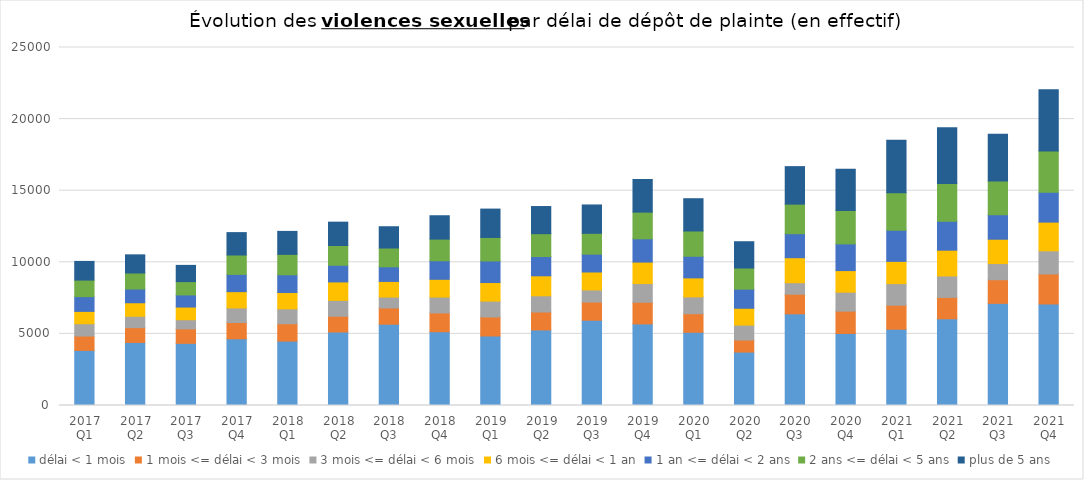
| Category | délai < 1 mois | 1 mois <= délai < 3 mois | 3 mois <= délai < 6 mois | 6 mois <= délai < 1 an | 1 an <= délai < 2 ans | 2 ans <= délai < 5 ans | plus de 5 ans |
|---|---|---|---|---|---|---|---|
| 2017 Q1 | 3848 | 1004 | 857 | 863 | 1029 | 1156 | 1305 |
| 2017 Q2 | 4405 | 1031 | 794 | 945 | 959 | 1119 | 1267 |
| 2017 Q3 | 4341 | 1010 | 638 | 886 | 846 | 931 | 1133 |
| 2017 Q4 | 4659 | 1139 | 1014 | 1139 | 1204 | 1354 | 1564 |
| 2018 Q1 | 4499 | 1209 | 1043 | 1141 | 1237 | 1426 | 1603 |
| 2018 Q2 | 5135 | 1099 | 1106 | 1290 | 1164 | 1378 | 1631 |
| 2018 Q3 | 5677 | 1135 | 759 | 1091 | 1022 | 1314 | 1486 |
| 2018 Q4 | 5153 | 1314 | 1103 | 1242 | 1294 | 1513 | 1632 |
| 2019 Q1 | 4854 | 1329 | 1106 | 1298 | 1505 | 1643 | 1981 |
| 2019 Q2 | 5276 | 1254 | 1130 | 1397 | 1344 | 1599 | 1894 |
| 2019 Q3 | 5955 | 1268 | 846 | 1254 | 1244 | 1458 | 1979 |
| 2019 Q4 | 5698 | 1511 | 1307 | 1499 | 1628 | 1860 | 2279 |
| 2020 Q1 | 5112 | 1298 | 1173 | 1330 | 1507 | 1765 | 2255 |
| 2020 Q2 | 3731 | 843 | 1041 | 1175 | 1335 | 1476 | 1836 |
| 2020 Q3 | 6402 | 1372 | 801 | 1745 | 1678 | 2063 | 2620 |
| 2020 Q4 | 5032 | 1558 | 1323 | 1508 | 1865 | 2324 | 2889 |
| 2021 Q1 | 5326 | 1680 | 1504 | 1555 | 2173 | 2621 | 3672 |
| 2021 Q2 | 6056 | 1495 | 1496 | 1799 | 2019 | 2637 | 3900 |
| 2021 Q3 | 7131 | 1651 | 1130 | 1699 | 1710 | 2356 | 3268 |
| 2021 Q4 | 7089 | 2097 | 1615 | 2005 | 2083 | 2889 | 4263 |